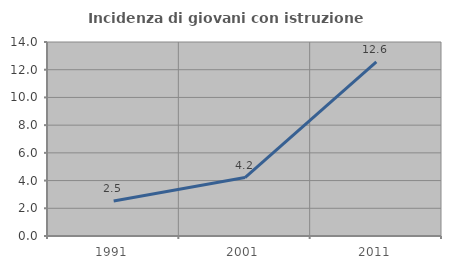
| Category | Incidenza di giovani con istruzione universitaria |
|---|---|
| 1991.0 | 2.521 |
| 2001.0 | 4.215 |
| 2011.0 | 12.558 |